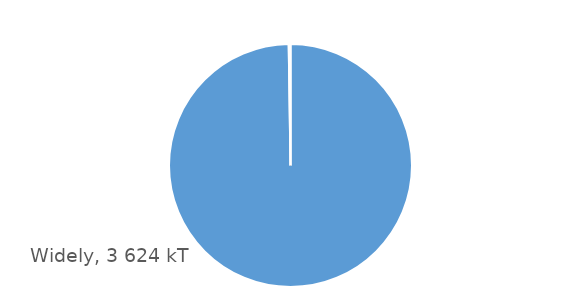
| Category | Widely |
|---|---|
| 0 | 3622880 |
| 1 | 7123 |
| 2 | 1508 |